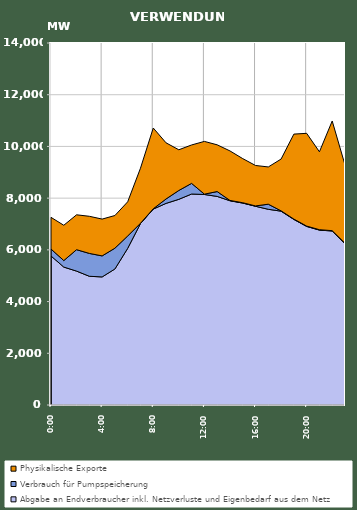
| Category | Abgabe an Endverbraucher inkl. Netzverluste und Eigenbedarf aus dem Netz | Verbrauch für Pumpspeicherung | Physikalische Exporte |
|---|---|---|---|
| 2007-01-17 | 5764.32 | 268.055 | 1224.706 |
| 2007-01-17 01:00:00 | 5334.121 | 251.792 | 1365.429 |
| 2007-01-17 02:00:00 | 5178.552 | 828.022 | 1348.868 |
| 2007-01-17 03:00:00 | 4978.322 | 883.848 | 1435.756 |
| 2007-01-17 04:00:00 | 4953.178 | 813.191 | 1423.415 |
| 2007-01-17 05:00:00 | 5260.85 | 803.281 | 1264.446 |
| 2007-01-17 06:00:00 | 6058.863 | 477.708 | 1322.207 |
| 2007-01-17 07:00:00 | 7016.703 | 11.026 | 2129.859 |
| 2007-01-17 08:00:00 | 7576.957 | 11.249 | 3124.414 |
| 2007-01-17 09:00:00 | 7797.34 | 170.57 | 2171.384 |
| 2007-01-17 10:00:00 | 7954.574 | 341.62 | 1574.337 |
| 2007-01-17 11:00:00 | 8159.471 | 411.507 | 1485.721 |
| 2007-01-17 12:00:00 | 8141.664 | 13.098 | 2039.952 |
| 2007-01-17 13:00:00 | 8066.559 | 188.35 | 1807.058 |
| 2007-01-17 14:00:00 | 7898.736 | 12.866 | 1914.806 |
| 2007-01-17 15:00:00 | 7808.746 | 13.683 | 1706.16 |
| 2007-01-17 16:00:00 | 7685.586 | 13.517 | 1564.454 |
| 2007-01-17 17:00:00 | 7568.813 | 196.989 | 1440.733 |
| 2007-01-17 18:00:00 | 7496.648 | 12.437 | 2001.894 |
| 2007-01-17 19:00:00 | 7176.99 | 13.18 | 3285.925 |
| 2007-01-17 20:00:00 | 6906.334 | 12.831 | 3587.991 |
| 2007-01-17 21:00:00 | 6764.186 | 15.267 | 3013.155 |
| 2007-01-17 22:00:00 | 6729.415 | 12.75 | 4241.439 |
| 2007-01-17 23:00:00 | 6233.079 | 23.387 | 3028.058 |